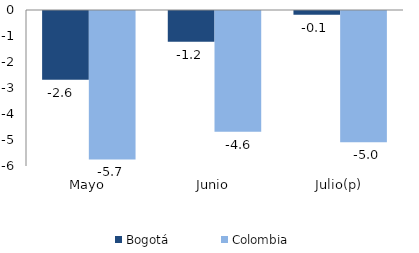
| Category | Bogotá | Colombia |
|---|---|---|
| Mayo | -2.647 | -5.707 |
| Junio | -1.187 | -4.642 |
| Julio(p) | -0.144 | -5.044 |